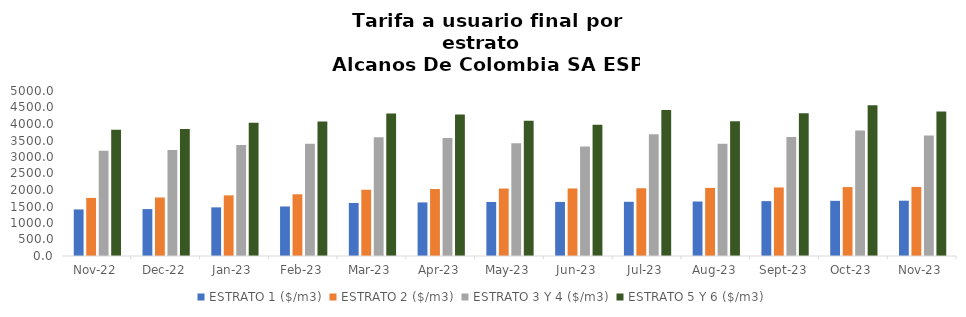
| Category | ESTRATO 1 ($/m3) | ESTRATO 2 ($/m3) | ESTRATO 3 Y 4 ($/m3) | ESTRATO 5 Y 6 ($/m3) |
|---|---|---|---|---|
| 2022-11-01 | 1410.78 | 1760.08 | 3185.9 | 3823.08 |
| 2022-12-01 | 1421.49 | 1773.44 | 3209.93 | 3851.916 |
| 2023-01-01 | 1473.58 | 1837.63 | 3365.49 | 4038.588 |
| 2023-02-01 | 1500.78 | 1870.23 | 3398.26 | 4077.912 |
| 2023-03-01 | 1607.06 | 2007.71 | 3596.1 | 4315.32 |
| 2023-04-01 | 1623.99 | 2028.8 | 3575.22 | 4290.264 |
| 2023-05-01 | 1636.8 | 2044.82 | 3416.65 | 4099.98 |
| 2023-06-01 | 1638.29 | 2046.54 | 3316.57 | 3979.884 |
| 2023-07-01 | 1643.12 | 2052.65 | 3689.81 | 4427.772 |
| 2023-08-01 | 1651.38 | 2063.23 | 3401.48 | 4081.776 |
| 2023-09-01 | 1662.79 | 2077.45 | 3603.59 | 4324.308 |
| 2023-10-01 | 1671.74 | 2088.57 | 3805.44 | 4566.528 |
| 2023-11-01 | 1676.02 | 2093.75 | 3648.51 | 4378.212 |